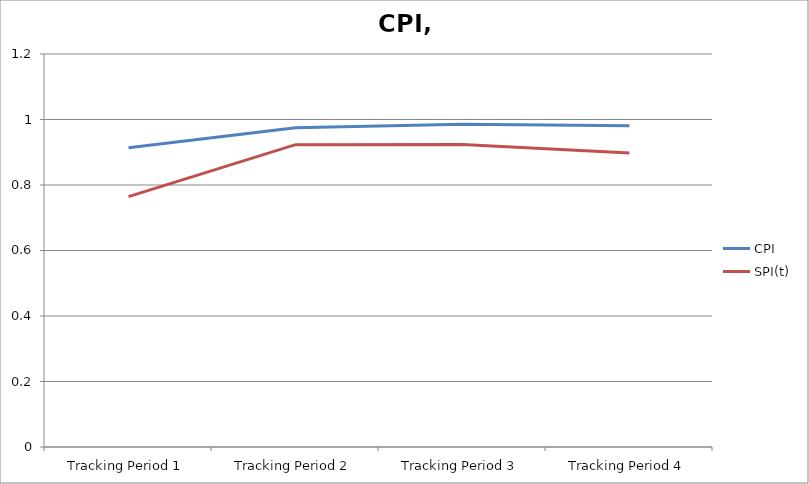
| Category | CPI | SPI(t) |
|---|---|---|
| Tracking Period 1 | 0.914 | 0.765 |
| Tracking Period 2 | 0.975 | 0.923 |
| Tracking Period 3 | 0.986 | 0.924 |
| Tracking Period 4 | 0.981 | 0.897 |